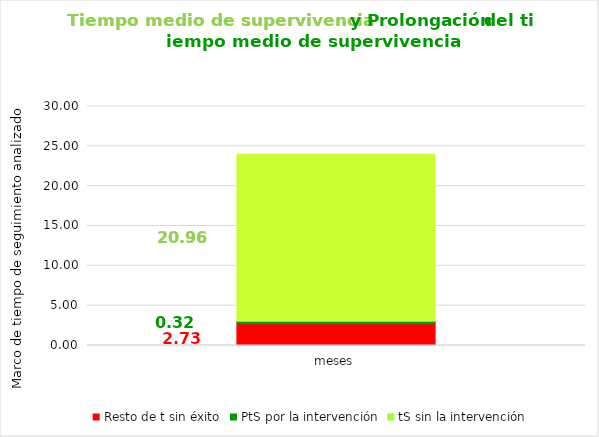
| Category | Resto de t sin éxito | PtS por la intervención | tS sin la intervención |
|---|---|---|---|
| meses | 2.727 | 0.317 | 20.956 |